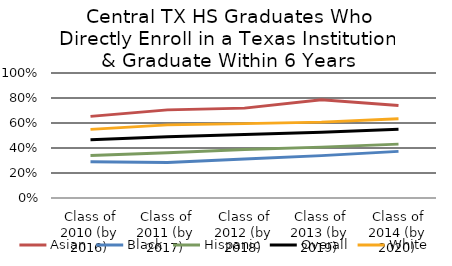
| Category | Asian | Black | Hispanic | Overall | White |
|---|---|---|---|---|---|
| Class of 2010 (by 2016) | 0.653 | 0.29 | 0.34 | 0.466 | 0.549 |
| Class of 2011 (by 2017) | 0.705 | 0.285 | 0.362 | 0.49 | 0.585 |
| Class of 2012 (by 2018) | 0.719 | 0.312 | 0.388 | 0.508 | 0.595 |
| Class of 2013 (by 2019) | 0.786 | 0.339 | 0.407 | 0.526 | 0.607 |
| Class of 2014 (by 2020) | 0.74 | 0.373 | 0.431 | 0.55 | 0.634 |